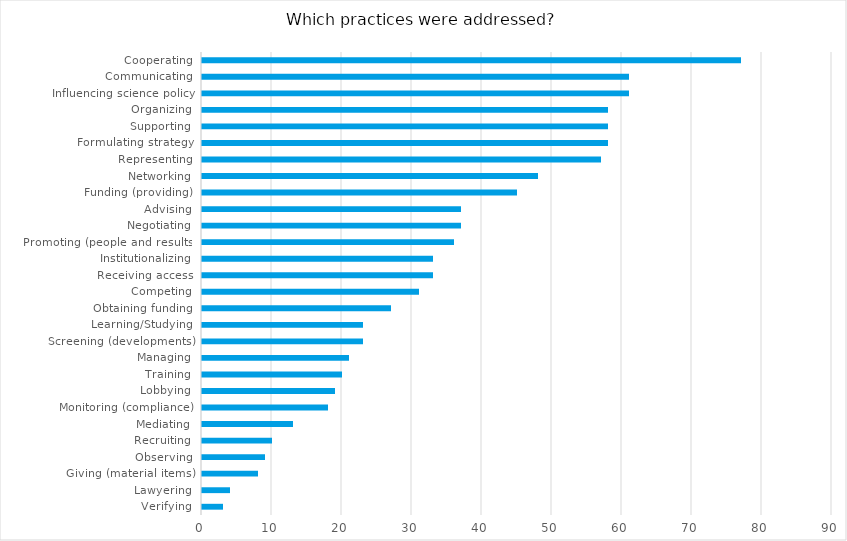
| Category | Series 0 |
|---|---|
| Verifying | 3 |
| Lawyering | 4 |
| Giving (material items) | 8 |
| Observing | 9 |
| Recruiting | 10 |
| Mediating | 13 |
| Monitoring (compliance) | 18 |
| Lobbying | 19 |
| Training | 20 |
| Managing | 21 |
| Screening (developments) | 23 |
| Learning/Studying | 23 |
| Obtaining funding | 27 |
| Competing | 31 |
| Receiving access | 33 |
| Institutionalizing | 33 |
| Promoting (people and results) | 36 |
| Negotiating | 37 |
| Advising | 37 |
| Funding (providing) | 45 |
| Networking | 48 |
| Representing | 57 |
| Formulating strategy | 58 |
| Supporting | 58 |
| Organizing | 58 |
| Influencing science policy | 61 |
| Communicating | 61 |
| Cooperating | 77 |